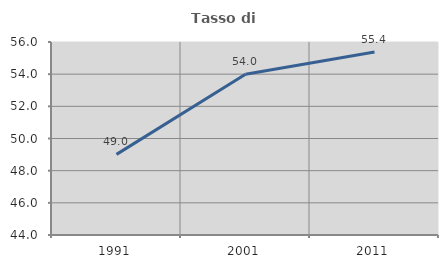
| Category | Tasso di occupazione   |
|---|---|
| 1991.0 | 49.012 |
| 2001.0 | 53.996 |
| 2011.0 | 55.372 |